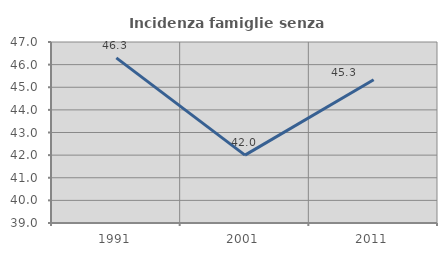
| Category | Incidenza famiglie senza nuclei |
|---|---|
| 1991.0 | 46.296 |
| 2001.0 | 42 |
| 2011.0 | 45.333 |